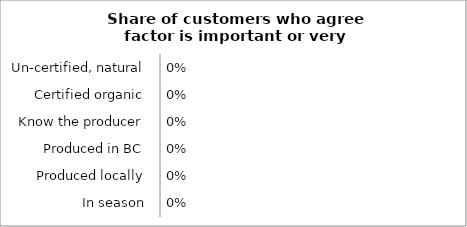
| Category | Series 0 |
|---|---|
| In season | 0 |
| Produced locally | 0 |
| Produced in BC | 0 |
| Know the producer | 0 |
| Certified organic | 0 |
| Un-certified, natural | 0 |